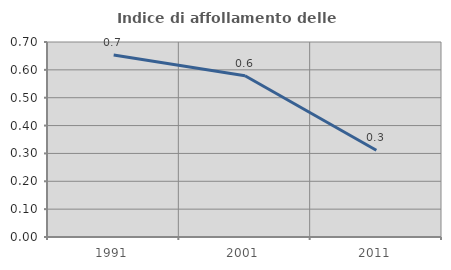
| Category | Indice di affollamento delle abitazioni  |
|---|---|
| 1991.0 | 0.654 |
| 2001.0 | 0.579 |
| 2011.0 | 0.312 |